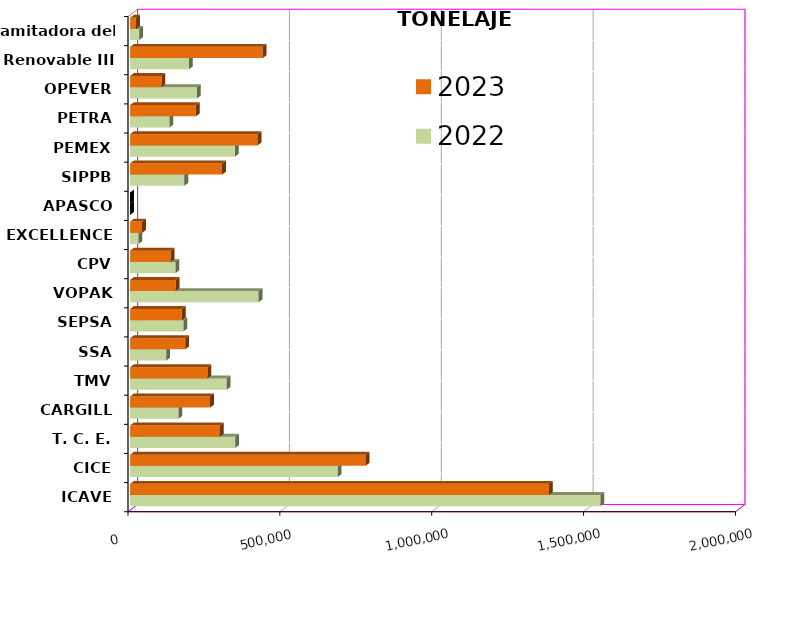
| Category | 2022 | 2023 |
|---|---|---|
| ICAVE | 1548813.97 | 1379279.54 |
| CICE | 683690.53 | 775330.19 |
| T. C. E. | 346150.344 | 295509.814 |
| CARGILL | 159152.55 | 263423.07 |
| TMV | 318355.53 | 254693.28 |
| SSA | 118980.409 | 181566.229 |
| SEPSA | 175830.75 | 170646.09 |
| VOPAK | 423010.302 | 150117.159 |
| CPV | 149613.62 | 133694.546 |
| EXCELLENCE | 27661.36 | 39556.523 |
| APASCO | 0 | 0 |
| SIPPB | 178525.563 | 302973.066 |
| PEMEX | 345056.644 | 419939.955 |
| PETRA | 129791.06 | 216726.08 |
| OPEVER | 220418.539 | 103154.81 |
| ESJ Renovable III | 193704.215 | 436848.02 |
| Tramitadora del Pac. | 29871.78 | 19689 |